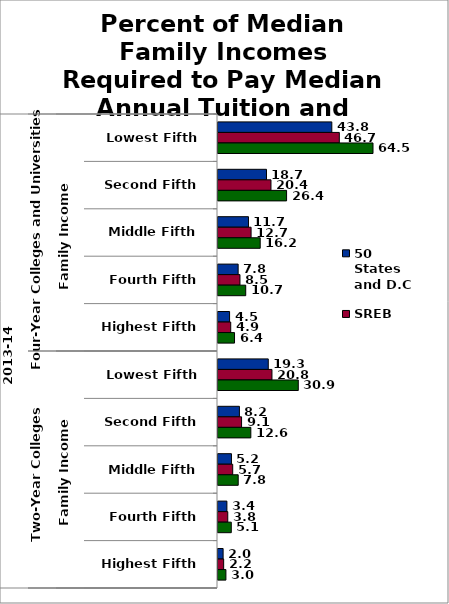
| Category | 50 States and D.C. | SREB states | State |
|---|---|---|---|
| 0 | 43.775 | 46.663 | 64.476 |
| 1 | 18.651 | 20.377 | 26.377 |
| 2 | 11.719 | 12.726 | 16.236 |
| 3 | 7.752 | 8.453 | 10.667 |
| 4 | 4.456 | 4.895 | 6.353 |
| 5 | 19.336 | 20.753 | 30.878 |
| 6 | 8.239 | 9.063 | 12.632 |
| 7 | 5.177 | 5.66 | 7.776 |
| 8 | 3.424 | 3.76 | 5.108 |
| 9 | 1.968 | 2.177 | 3.043 |